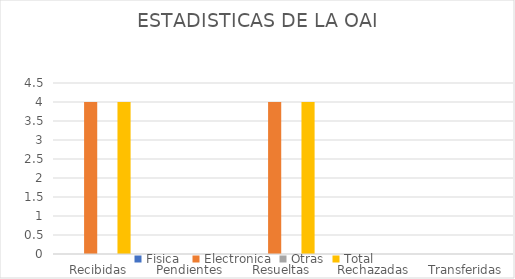
| Category | Fisica  | Electronica | Otras | Total |
|---|---|---|---|---|
| Recibidas | 0 | 4 | 0 | 4 |
| Pendientes | 0 | 0 | 0 | 0 |
| Resueltas | 0 | 4 | 0 | 4 |
| Rechazadas | 0 | 0 | 0 | 0 |
| Transferidas | 0 | 0 | 0 | 0 |